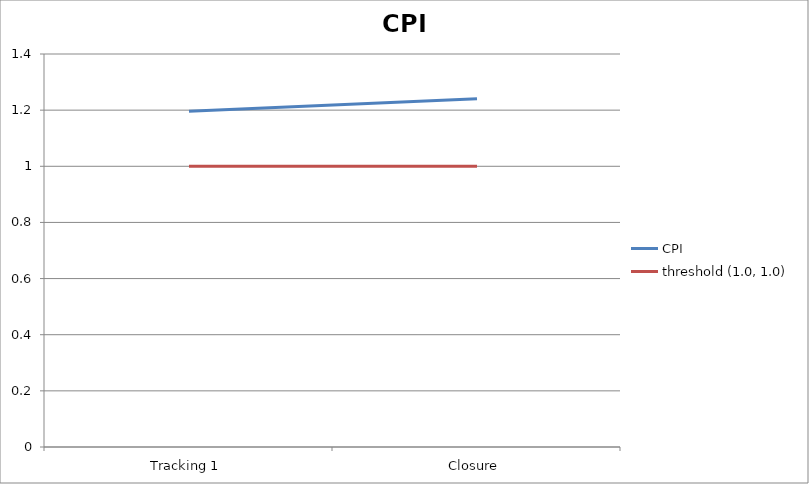
| Category | CPI | threshold (1.0, 1.0) |
|---|---|---|
| Tracking 1 | 1.196 | 1 |
| Closure | 1.241 | 1 |